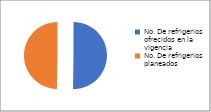
| Category | Series 0 |
|---|---|
| No. De refrigerios ofrecidos en la vigencia | 34316 |
| No. De refrigerios planeados | 34000 |